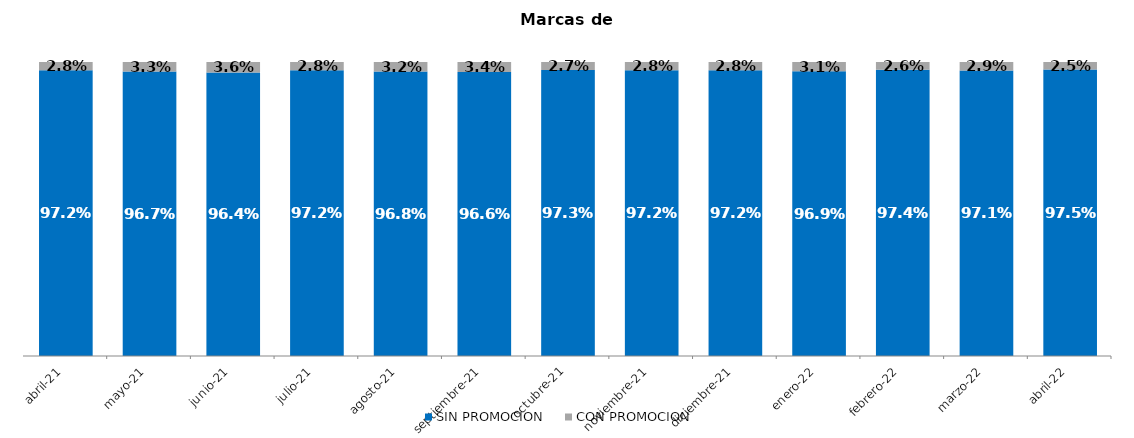
| Category | SIN PROMOCION   | CON PROMOCION   |
|---|---|---|
| 2021-04-01 | 0.972 | 0.028 |
| 2021-05-01 | 0.967 | 0.033 |
| 2021-06-01 | 0.964 | 0.036 |
| 2021-07-01 | 0.972 | 0.028 |
| 2021-08-01 | 0.968 | 0.032 |
| 2021-09-01 | 0.966 | 0.034 |
| 2021-10-01 | 0.973 | 0.027 |
| 2021-11-01 | 0.972 | 0.028 |
| 2021-12-01 | 0.972 | 0.028 |
| 2022-01-01 | 0.969 | 0.031 |
| 2022-02-01 | 0.974 | 0.026 |
| 2022-03-01 | 0.971 | 0.029 |
| 2022-04-01 | 0.975 | 0.025 |